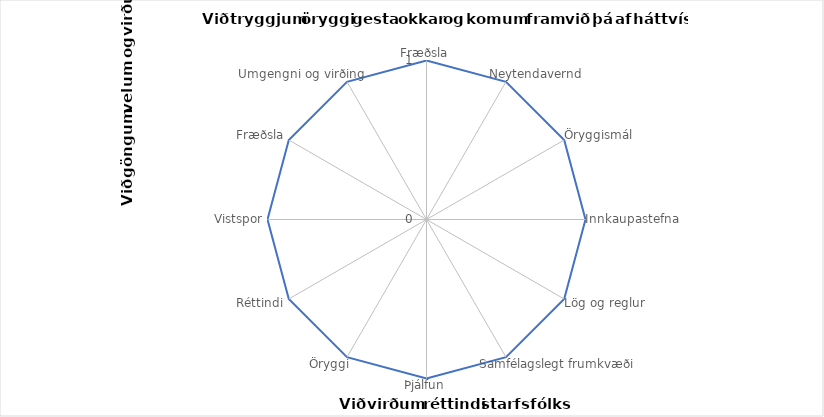
| Category | Series 0 |
|---|---|
| Fræðsla | 1 |
| Neytendavernd | 1 |
| Öryggismál | 1 |
| Innkaupastefna | 1 |
| Lög og reglur | 1 |
| Samfélagslegt frumkvæði | 1 |
| Þjálfun | 1 |
| Öryggi | 1 |
| Réttindi | 1 |
| Vistspor | 1 |
| Fræðsla | 1 |
| Umgengni og virðing | 1 |